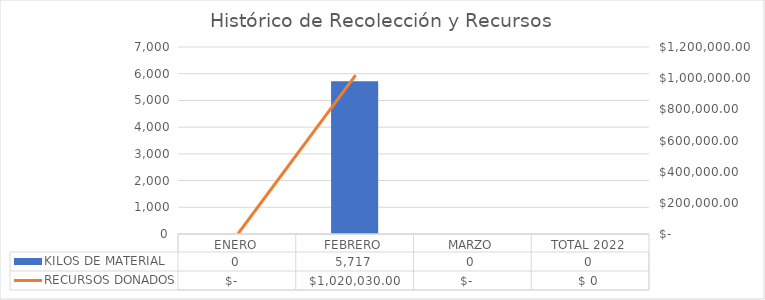
| Category | KILOS DE MATERIAL |
|---|---|
| ENERO | 0 |
| FEBRERO | 5717 |
| MARZO | 0 |
| TOTAL 2022 | 0 |